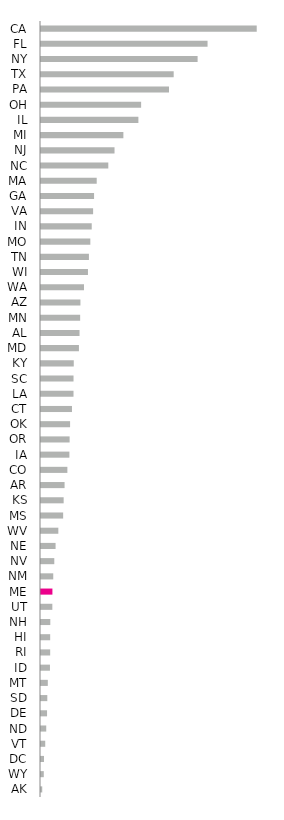
| Category | Value |
|---|---|
| CA | 0 |
| FL | 0 |
| NY | 0 |
| TX | 0 |
| PA | 0 |
| OH | 0 |
| IL | 0 |
| MI | 0 |
| NJ | 0 |
| NC | 0 |
| MA | 0 |
| GA | 0 |
| VA | 0 |
| IN | 0 |
| MO | 0 |
| TN | 0 |
| WI | 0 |
| WA | 0 |
| AZ | 0 |
| MN | 0 |
| AL | 0 |
| MD | 0 |
| KY | 0 |
| SC | 0 |
| LA | 0 |
| CT | 0 |
| OK | 0 |
| OR | 0 |
| IA | 0 |
| CO | 0 |
| AR | 0 |
| KS | 0 |
| MS | 0 |
| WV | 0 |
| NE | 0 |
| NV | 0 |
| NM | 0 |
| ME | 102.61 |
| UT | 0 |
| NH | 0 |
| HI | 0 |
| RI | 0 |
| ID | 0 |
| MT | 0 |
| SD | 0 |
| DE | 0 |
| ND | 0 |
| VT | 0 |
| DC | 0 |
| WY | 0 |
| AK | 0 |